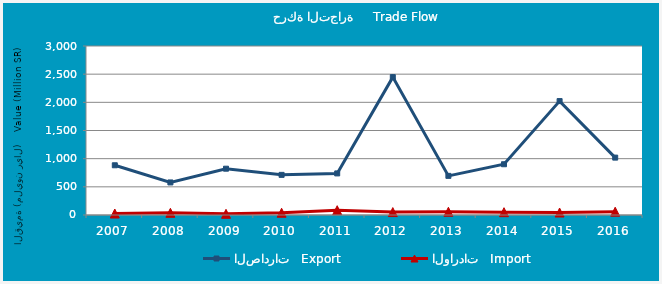
| Category | الصادرات   Export | الواردات   Import |
|---|---|---|
| 2007.0 | 882.854 | 26.261 |
| 2008.0 | 577.917 | 38.863 |
| 2009.0 | 822.097 | 21.219 |
| 2010.0 | 712.492 | 40.034 |
| 2011.0 | 738.257 | 85.323 |
| 2012.0 | 2447.251 | 52.014 |
| 2013.0 | 694.64 | 57.508 |
| 2014.0 | 900.991 | 50.063 |
| 2015.0 | 2022.234 | 43.954 |
| 2016.0 | 1018.623 | 58.309 |